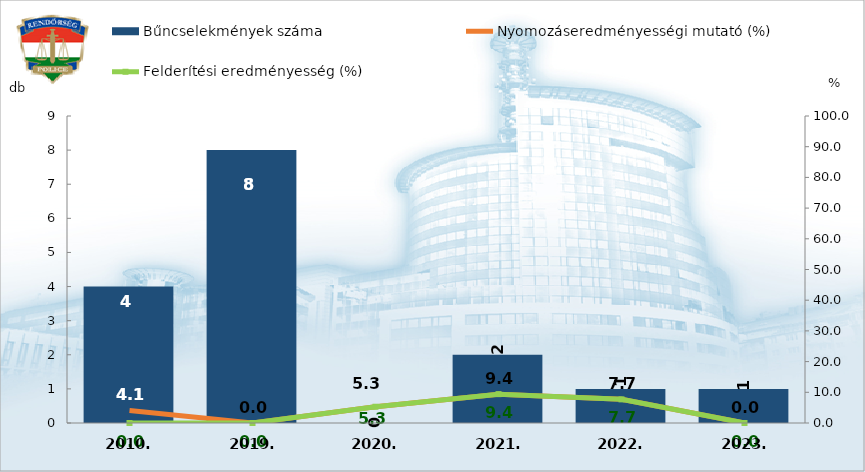
| Category | Bűncselekmények száma |
|---|---|
| 2010. | 4 |
| 2019. | 8 |
| 2020. | 0 |
| 2021. | 2 |
| 2022. | 1 |
| 2023. | 1 |